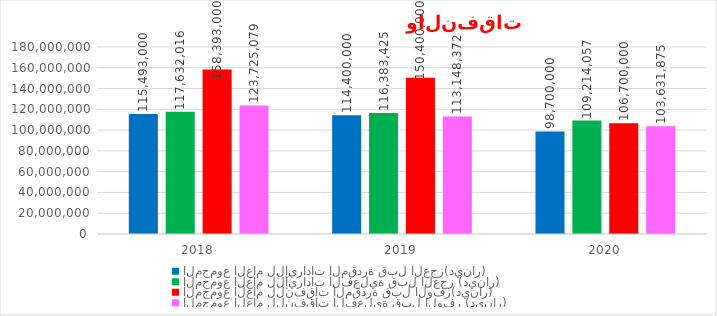
| Category | المجموع العام للإيرادات المقدرة قبل العجز(دينار) | المجموع العام للإيرادات الفعلية قبل العجز (دينار) | المجموع العام للنفقات المقدرة قبل الوفر(دينار) | المجموع العام للنفقات الفعلية قبل الوفر (دينار) |
|---|---|---|---|---|
| 2018.0 | 115493000 | 117632016.339 | 158393000 | 123725079 |
| 2019.0 | 114400000 | 116383425 | 150400000 | 113148372 |
| 2020.0 | 98700000 | 109214057 | 106700000 | 103631875 |